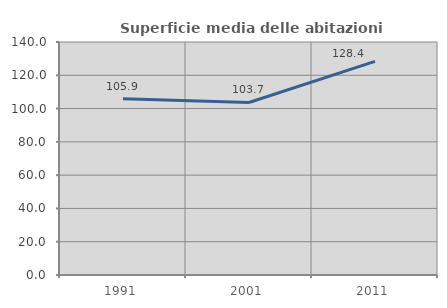
| Category | Superficie media delle abitazioni occupate |
|---|---|
| 1991.0 | 105.855 |
| 2001.0 | 103.659 |
| 2011.0 | 128.389 |